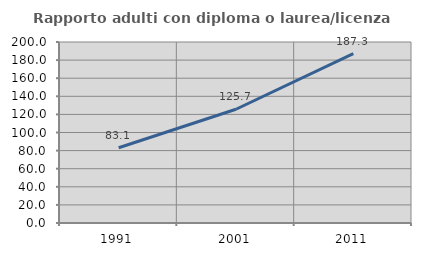
| Category | Rapporto adulti con diploma o laurea/licenza media  |
|---|---|
| 1991.0 | 83.146 |
| 2001.0 | 125.668 |
| 2011.0 | 187.261 |